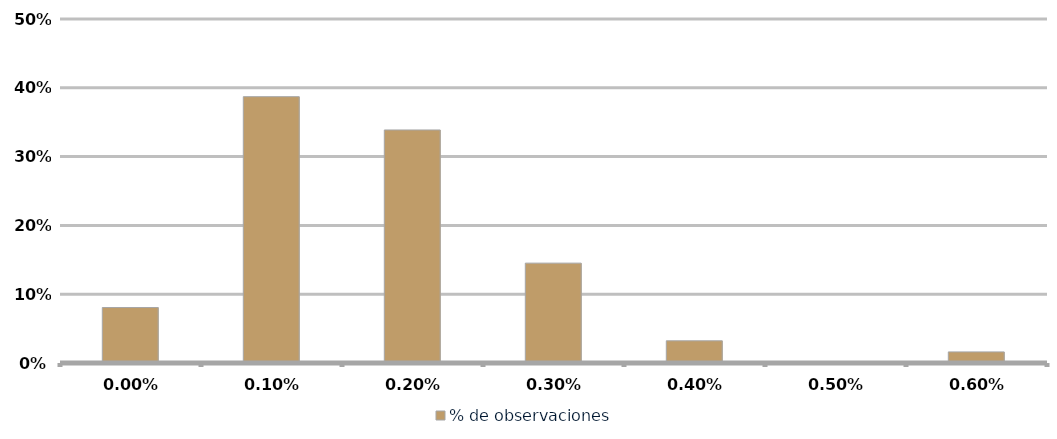
| Category | % de observaciones  |
|---|---|
| 0.0 | 0.081 |
| 0.001 | 0.387 |
| 0.002 | 0.339 |
| 0.003 | 0.145 |
| 0.004 | 0.032 |
| 0.005 | 0 |
| 0.006 | 0.016 |